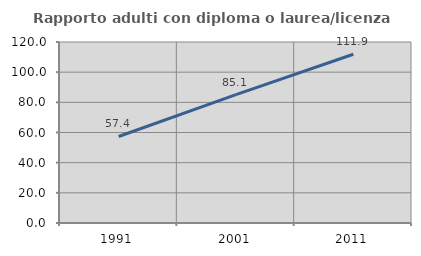
| Category | Rapporto adulti con diploma o laurea/licenza media  |
|---|---|
| 1991.0 | 57.353 |
| 2001.0 | 85.081 |
| 2011.0 | 111.856 |